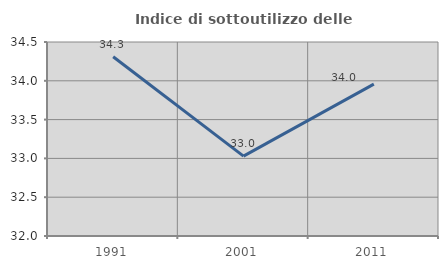
| Category | Indice di sottoutilizzo delle abitazioni  |
|---|---|
| 1991.0 | 34.31 |
| 2001.0 | 33.03 |
| 2011.0 | 33.958 |